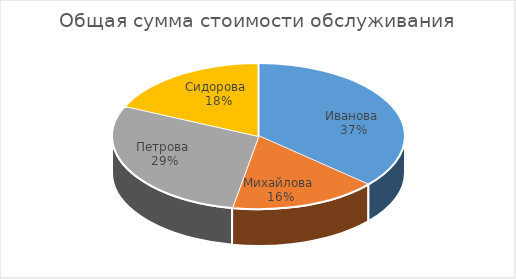
| Category | Series 0 |
|---|---|
| Иванова  | 1710 |
| Михайлова  | 765 |
| Петрова  | 1350 |
| Сидорова  | 855 |